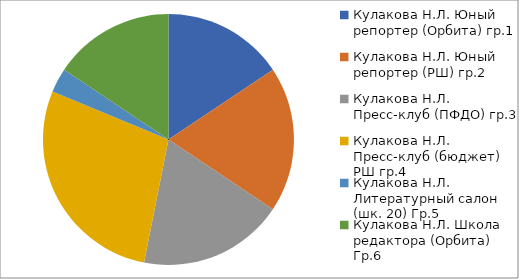
| Category | Series 0 | Series 1 | Series 2 | Series 3 | Series 4 |
|---|---|---|---|---|---|
| 0 | 5 | 3 | 0 | 0 | 2 |
| 1 | 6 | 5 | 1 | 0 | 0 |
| 2 | 6 | 5 | 3 | 0 | 2 |
| 3 | 9 | 4 | 4 | 1 | 1 |
| 4 | 1 | 3 | 2 | 0 | 0 |
| 5 | 5 | 0 | 2 | 0 | 0 |